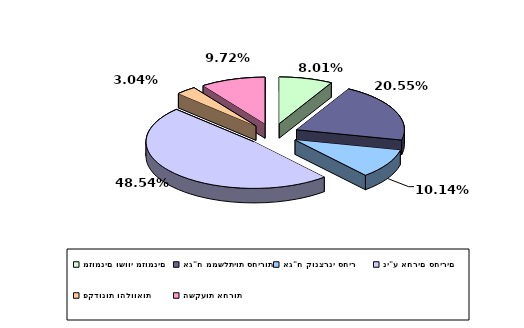
| Category | Series 0 |
|---|---|
| מזומנים ושווי מזומנים | 0.08 |
| אג"ח ממשלתיות סחירות | 0.205 |
| אג"ח קונצרני סחיר | 0.101 |
| ני"ע אחרים סחירים | 0.485 |
| פקדונות והלוואות | 0.03 |
| השקעות אחרות | 0.097 |